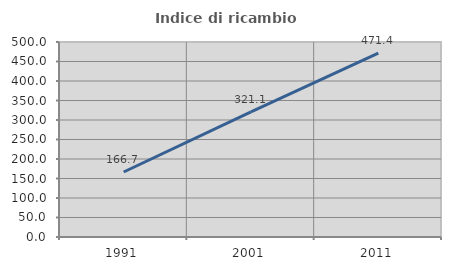
| Category | Indice di ricambio occupazionale  |
|---|---|
| 1991.0 | 166.667 |
| 2001.0 | 321.053 |
| 2011.0 | 471.429 |